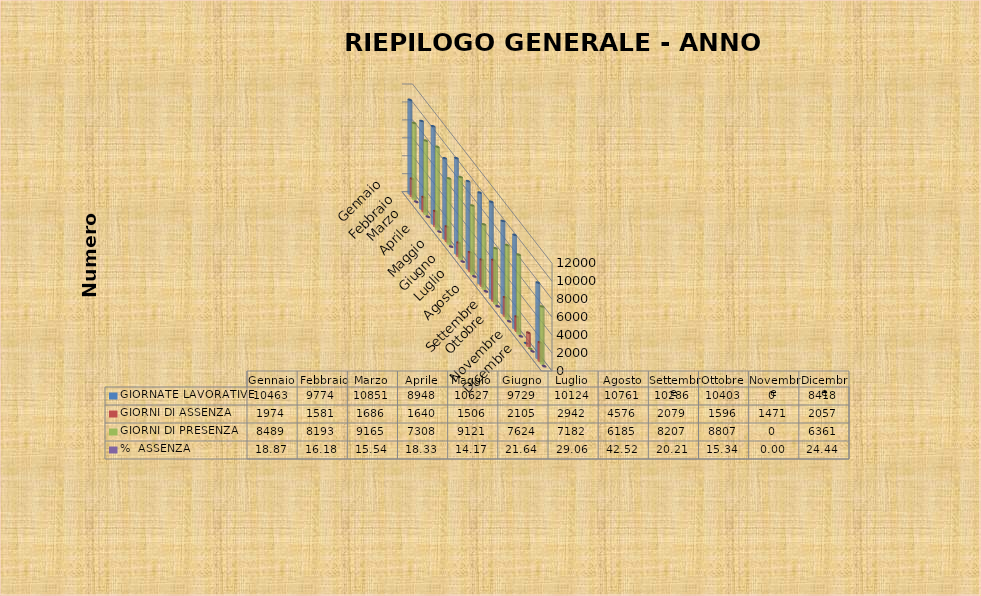
| Category | GIORNATE LAVORATIVE | GIORNI DI ASSENZA | GIORNI DI PRESENZA | %  ASSENZA |
|---|---|---|---|---|
| Gennaio | 10463 | 1974 | 8489 | 18.866 |
| Febbraio | 9774 | 1581 | 8193 | 16.176 |
| Marzo | 10851 | 1686 | 9165 | 15.538 |
| Aprile | 8948 | 1640 | 7308 | 18.328 |
| Maggio | 10627 | 1506 | 9121 | 14.171 |
| Giugno | 9729 | 2105 | 7624 | 21.636 |
| Luglio | 10124 | 2942 | 7182 | 29.06 |
| Agosto | 10761 | 4576 | 6185 | 42.524 |
| Settembre | 10286 | 2079 | 8207 | 20.212 |
| Ottobre | 10403 | 1596 | 8807 | 15.342 |
| Novembre | 0 | 1471 | 0 | 0 |
| Dicembre | 8418 | 2057 | 6361 | 24.436 |